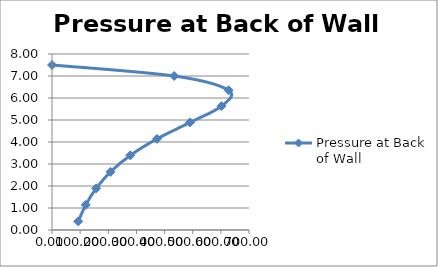
| Category | Pressure at Back of Wall |
|---|---|
| 0.0 | 7.5 |
| 434.09688581314873 | 7 |
| 627.27 | 6.352 |
| 602.1792 | 5.628 |
| 490.0546874999998 | 4.888 |
| 373.15288518738845 | 4.142 |
| 278.3742603550296 | 3.393 |
| 207.8527810650888 | 2.643 |
| 156.81749999999994 | 1.892 |
| 120.00063768732065 | 1.142 |
| 93.23275862068967 | 0.391 |